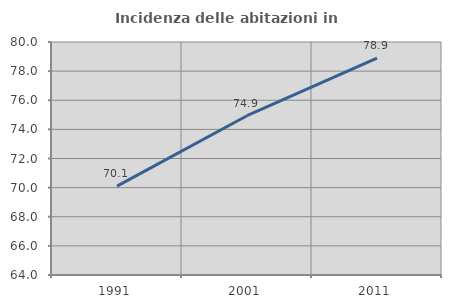
| Category | Incidenza delle abitazioni in proprietà  |
|---|---|
| 1991.0 | 70.102 |
| 2001.0 | 74.938 |
| 2011.0 | 78.9 |